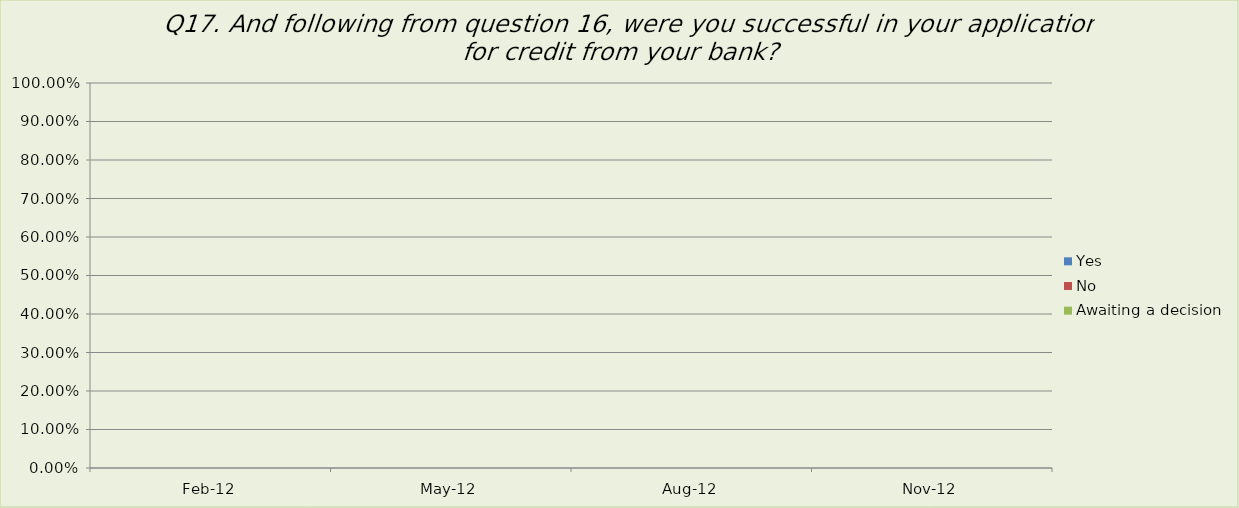
| Category | Yes | No | Awaiting a decision |
|---|---|---|---|
| 2012-02-01 | 0 | 0 | 0 |
| 2012-05-01 | 0 | 0 | 0 |
| 2012-08-01 | 0 | 0 | 0 |
| 2012-11-01 | 0 | 0 | 0 |